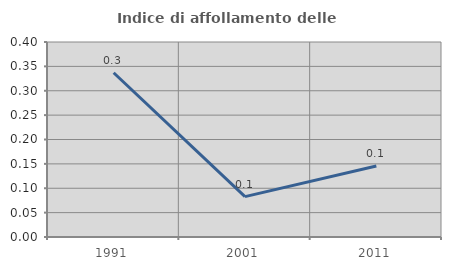
| Category | Indice di affollamento delle abitazioni  |
|---|---|
| 1991.0 | 0.337 |
| 2001.0 | 0.083 |
| 2011.0 | 0.146 |